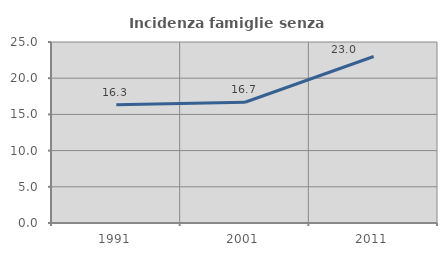
| Category | Incidenza famiglie senza nuclei |
|---|---|
| 1991.0 | 16.344 |
| 2001.0 | 16.682 |
| 2011.0 | 23.001 |